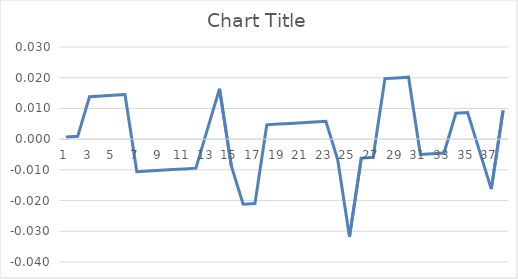
| Category | Series 0 |
|---|---|
| 0 | 0.001 |
| 1 | 0.001 |
| 2 | 0.014 |
| 3 | 0.014 |
| 4 | 0.014 |
| 5 | 0.015 |
| 6 | -0.011 |
| 7 | -0.01 |
| 8 | -0.01 |
| 9 | -0.01 |
| 10 | -0.01 |
| 11 | -0.009 |
| 12 | 0.003 |
| 13 | 0.016 |
| 14 | -0.009 |
| 15 | -0.021 |
| 16 | -0.021 |
| 17 | 0.005 |
| 18 | 0.005 |
| 19 | 0.005 |
| 20 | 0.005 |
| 21 | 0.006 |
| 22 | 0.006 |
| 23 | -0.007 |
| 24 | -0.032 |
| 25 | -0.006 |
| 26 | -0.006 |
| 27 | 0.02 |
| 28 | 0.02 |
| 29 | 0.02 |
| 30 | -0.005 |
| 31 | -0.005 |
| 32 | -0.005 |
| 33 | 0.008 |
| 34 | 0.009 |
| 35 | -0.004 |
| 36 | -0.016 |
| 37 | 0.009 |